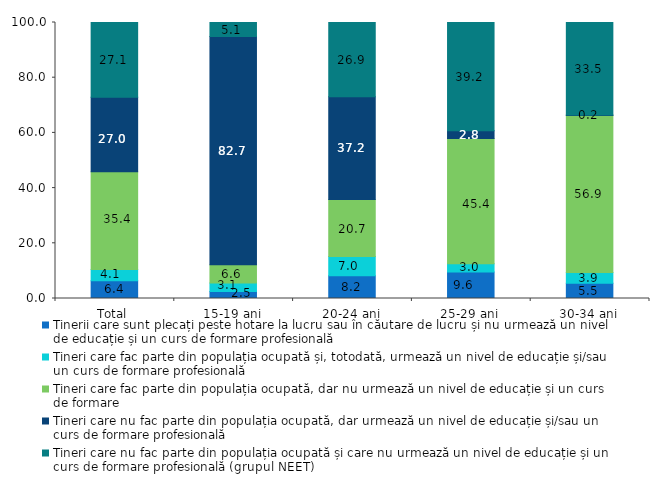
| Category | Tinerii care sunt plecați peste hotare la lucru sau în căutare de lucru și nu urmează un nivel de educație și un curs de formare profesională | Tineri care fac parte din populația ocupată și, totodată, urmează un nivel de educație și/sau un curs de formare profesională | Tineri care fac parte din populația ocupată, dar nu urmează un nivel de educație și un curs de formare | Tineri care nu fac parte din populația ocupată, dar urmează un nivel de educație și/sau un curs de formare profesională | Tineri care nu fac parte din populația ocupată și care nu urmează un nivel de educație și un curs de formare profesională (grupul NEET) |
|---|---|---|---|---|---|
| Total | 6.4 | 4.1 | 35.4 | 27 | 27.1 |
| 15-19 ani | 2.5 | 3.1 | 6.6 | 82.7 | 5.1 |
| 20-24 ani | 8.2 | 7 | 20.7 | 37.2 | 26.9 |
| 25-29 ani | 9.6 | 3 | 45.4 | 2.8 | 39.2 |
| 30-34 ani | 5.5 | 3.9 | 56.9 | 0.2 | 33.5 |